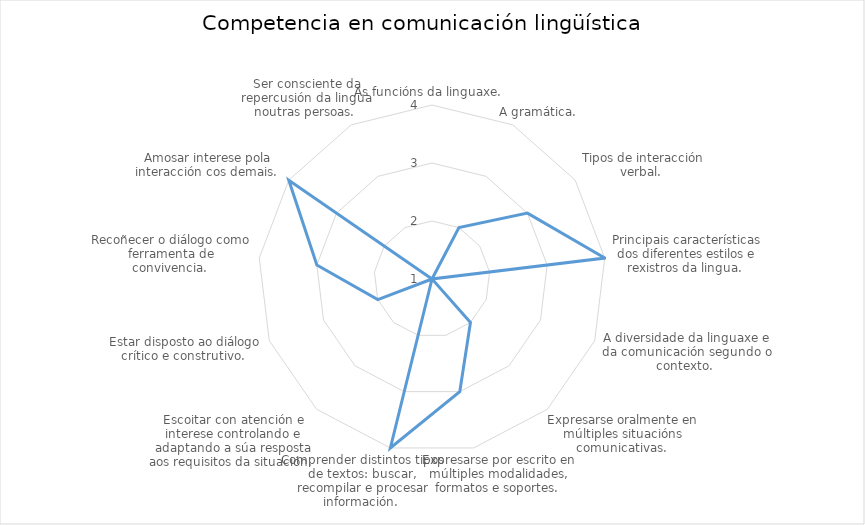
| Category | Series 0 |
|---|---|
| As funcións da linguaxe.  | 1 |
| A gramática.  | 2 |
| Tipos de interacción verbal.  | 3 |
| Principais características dos diferentes estilos e rexistros da lingua.  | 4 |
| A diversidade da linguaxe e da comunicación segundo o contexto.  | 1 |
| Expresarse oralmente en múltiples situacións comunicativas.  | 2 |
| Expresarse por escrito en múltiples modalidades, formatos e soportes.  | 3 |
| Comprender distintos tipos de textos: buscar, recompilar e procesar información.  | 4 |
| Escoitar con atención e interese controlando e adaptando a súa resposta aos requisitos da situación.  | 1 |
| Estar disposto ao diálogo crítico e construtivo.  | 2 |
| Recoñecer o diálogo como ferramenta de convivencia.  | 3 |
| Amosar interese pola interacción cos demais.  | 4 |
| Ser consciente da repercusión da lingua noutras persoas.  | 1 |